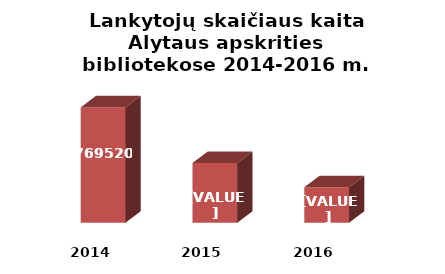
| Category | Series 0 |
|---|---|
| 2014.0 | 769520 |
| 2015.0 | 731161 |
| 2016.0 | 714513 |